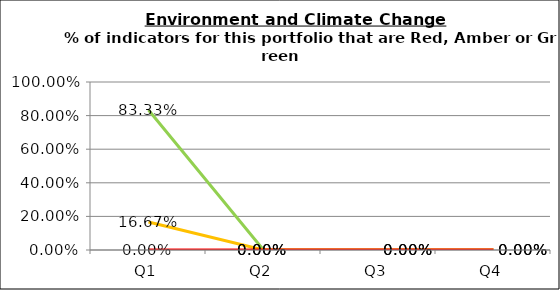
| Category | Green | Amber | Red |
|---|---|---|---|
| Q1 | 0.833 | 0.167 | 0 |
| Q2 | 0 | 0 | 0 |
| Q3 | 0 | 0 | 0 |
| Q4 | 0 | 0 | 0 |